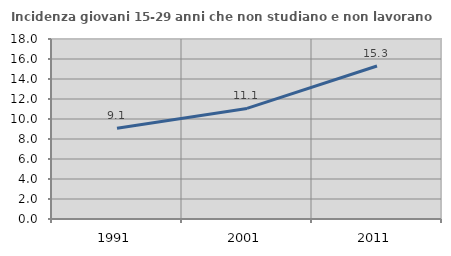
| Category | Incidenza giovani 15-29 anni che non studiano e non lavorano  |
|---|---|
| 1991.0 | 9.08 |
| 2001.0 | 11.057 |
| 2011.0 | 15.299 |